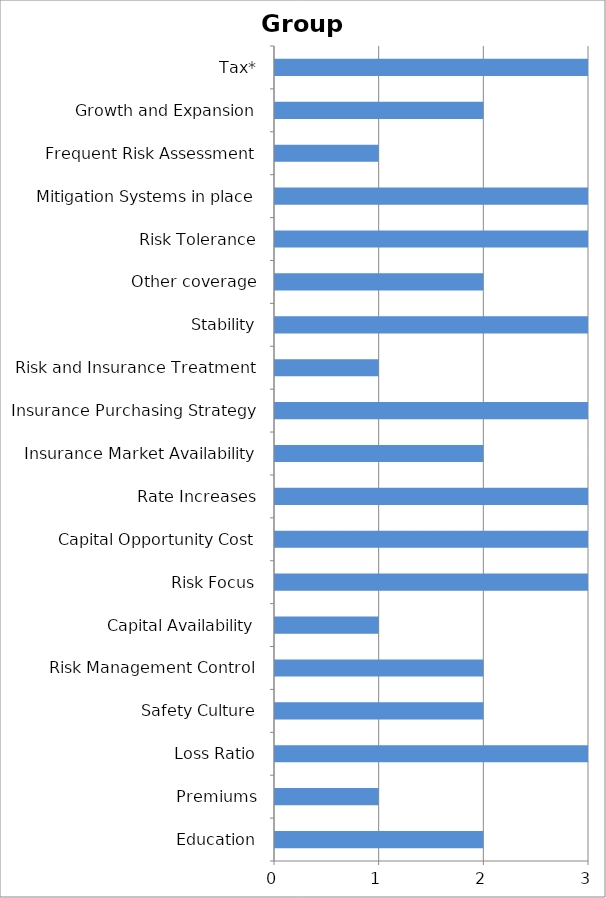
| Category | Series 0 |
|---|---|
| Education | 2 |
| Premiums | 1 |
| Loss Ratio | 3 |
| Safety Culture | 2 |
| Risk Management Control | 2 |
| Capital Availability | 1 |
| Risk Focus | 3 |
| Capital Opportunity Cost | 3 |
| Rate Increases | 3 |
| Insurance Market Availability | 2 |
| Insurance Purchasing Strategy | 3 |
| Risk and Insurance Treatment | 1 |
| Stability | 3 |
| Other coverage | 2 |
| Risk Tolerance | 3 |
| Mitigation Systems in place | 3 |
| Frequent Risk Assessment | 1 |
| Growth and Expansion | 2 |
| Tax* | 3 |